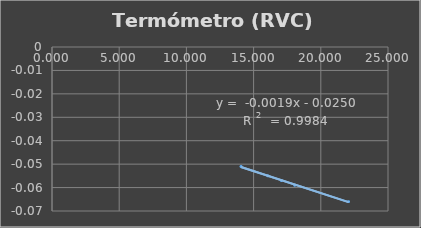
| Category | Termómetro utilizado en el liquido del RVC |
|---|---|
| 14.064 | -0.051 |
| 16.068 | -0.055 |
| 17.065 | -0.057 |
| 18.064 | -0.059 |
| 22.067 | -0.066 |